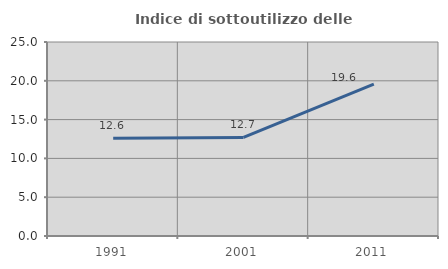
| Category | Indice di sottoutilizzo delle abitazioni  |
|---|---|
| 1991.0 | 12.606 |
| 2001.0 | 12.696 |
| 2011.0 | 19.58 |